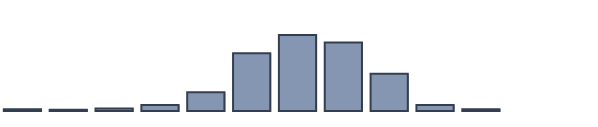
| Category | Series 0 |
|---|---|
| 0 | 0.606 |
| 1 | 0.455 |
| 2 | 0.909 |
| 3 | 2.121 |
| 4 | 6.742 |
| 5 | 20.833 |
| 6 | 27.424 |
| 7 | 24.697 |
| 8 | 13.409 |
| 9 | 2.197 |
| 10 | 0.606 |
| 11 | 0 |
| 12 | 0 |